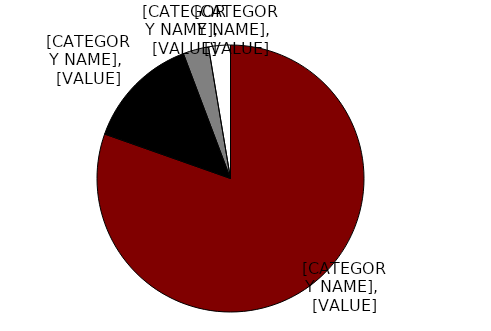
| Category | Series 0 |
|---|---|
| None | 0.804 |
| Once | 0.139 |
| Twice | 0.031 |
| Three plus | 0.026 |